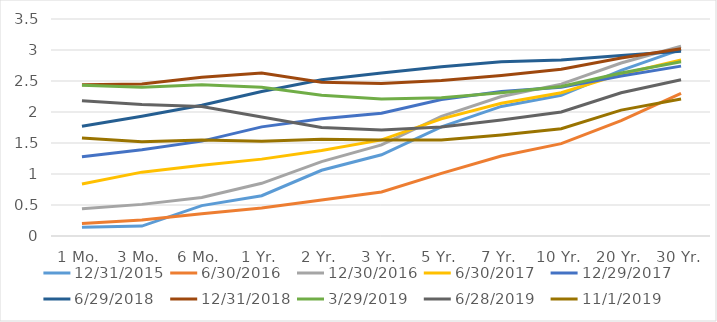
| Category | 12/31/2015 | 6/30/2016 | 12/30/2016 | 6/30/2017 | 12/29/2017 | 6/29/2018 | 12/31/2018 | 3/29/2019 | 6/28/2019 | 11/1/2019 |
|---|---|---|---|---|---|---|---|---|---|---|
| 1 Mo. | 0.14 | 0.2 | 0.44 | 0.84 | 1.28 | 1.77 | 2.44 | 2.43 | 2.18 | 1.58 |
| 3 Mo. | 0.16 | 0.26 | 0.51 | 1.03 | 1.39 | 1.93 | 2.45 | 2.4 | 2.12 | 1.52 |
| 6 Mo. | 0.49 | 0.36 | 0.62 | 1.14 | 1.53 | 2.11 | 2.56 | 2.44 | 2.09 | 1.55 |
| 1 Yr. | 0.65 | 0.45 | 0.85 | 1.24 | 1.76 | 2.33 | 2.63 | 2.4 | 1.92 | 1.53 |
| 2 Yr. | 1.06 | 0.58 | 1.2 | 1.38 | 1.89 | 2.52 | 2.48 | 2.27 | 1.75 | 1.56 |
| 3 Yr. | 1.31 | 0.71 | 1.47 | 1.55 | 1.98 | 2.63 | 2.46 | 2.21 | 1.71 | 1.55 |
| 5 Yr. | 1.76 | 1.01 | 1.93 | 1.89 | 2.2 | 2.73 | 2.51 | 2.23 | 1.76 | 1.55 |
| 7 Yr. | 2.09 | 1.29 | 2.25 | 2.14 | 2.33 | 2.81 | 2.59 | 2.31 | 1.87 | 1.63 |
| 10 Yr. | 2.27 | 1.49 | 2.45 | 2.31 | 2.4 | 2.84 | 2.69 | 2.41 | 2 | 1.73 |
| 20 Yr. | 2.67 | 1.86 | 2.79 | 2.61 | 2.58 | 2.91 | 2.87 | 2.63 | 2.31 | 2.03 |
| 30 Yr. | 3.01 | 2.3 | 3.06 | 2.84 | 2.74 | 2.98 | 3.02 | 2.81 | 2.52 | 2.21 |